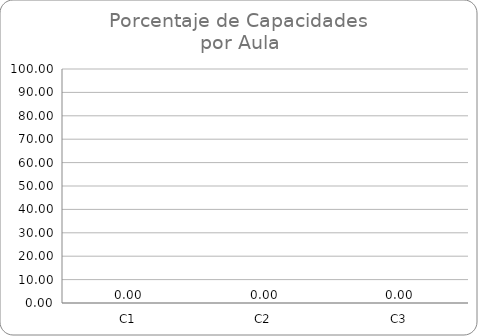
| Category | Series 0 |
|---|---|
| C1 | 0 |
| C2 | 0 |
| C3 | 0 |